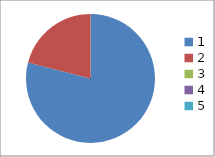
| Category | Series 0 |
|---|---|
| 0 | 0.79 |
| 1 | 0.21 |
| 2 | 0 |
| 3 | 0 |
| 4 | 0 |